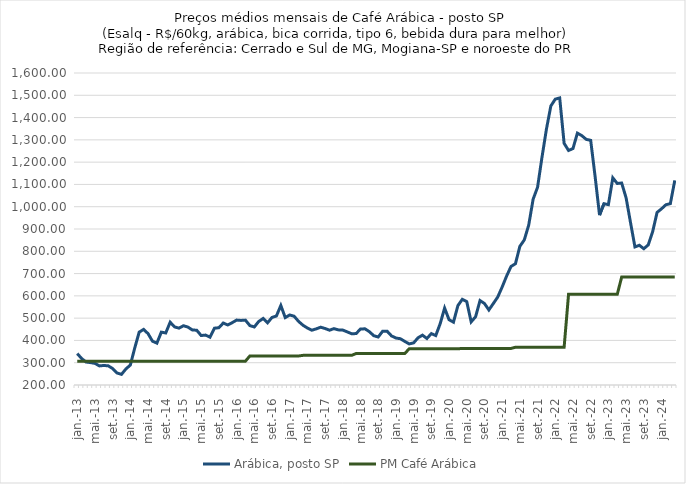
| Category | Arábica, posto SP | PM Café Arábica |
|---|---|---|
| 2013-01-01 | 341.166 | 307 |
| 2013-02-01 | 318.712 | 307 |
| 2013-03-01 | 303.054 | 307 |
| 2013-04-01 | 300.587 | 307 |
| 2013-05-01 | 297.253 | 307 |
| 2013-06-01 | 285.707 | 307 |
| 2013-07-01 | 287.572 | 307 |
| 2013-08-01 | 286.175 | 307 |
| 2013-09-01 | 273.901 | 307 |
| 2013-10-01 | 253.937 | 307 |
| 2013-11-01 | 247.729 | 307 |
| 2013-12-01 | 272.095 | 307 |
| 2014-01-01 | 289.435 | 307 |
| 2014-02-01 | 366.323 | 307 |
| 2014-03-01 | 437.237 | 307 |
| 2014-04-01 | 449.452 | 307 |
| 2014-05-01 | 430.557 | 307 |
| 2014-06-01 | 396.734 | 307 |
| 2014-07-01 | 387.72 | 307 |
| 2014-08-01 | 437.192 | 307 |
| 2014-09-01 | 433.523 | 307 |
| 2014-10-01 | 481.643 | 307 |
| 2014-11-01 | 460.557 | 307 |
| 2014-12-01 | 455.201 | 307 |
| 2015-01-01 | 465.926 | 307 |
| 2015-02-01 | 459.993 | 307 |
| 2015-03-01 | 447.102 | 307 |
| 2015-04-01 | 445.686 | 307 |
| 2015-05-01 | 421.945 | 307 |
| 2015-06-01 | 424.023 | 307 |
| 2015-07-01 | 414.498 | 307 |
| 2015-08-01 | 454.981 | 307 |
| 2015-09-01 | 456.954 | 307 |
| 2015-10-01 | 478.11 | 307 |
| 2015-11-01 | 469.394 | 307 |
| 2015-12-01 | 479.505 | 307 |
| 2016-01-01 | 491.313 | 307 |
| 2016-02-01 | 489.824 | 307 |
| 2016-03-01 | 491.065 | 307 |
| 2016-04-01 | 466.707 | 330.24 |
| 2016-05-01 | 460.367 | 330.24 |
| 2016-06-01 | 484.872 | 330.24 |
| 2016-07-01 | 498.517 | 330.24 |
| 2016-08-01 | 479.037 | 330.24 |
| 2016-09-01 | 502.947 | 330.24 |
| 2016-10-01 | 509.528 | 330.24 |
| 2016-11-01 | 556.744 | 330.24 |
| 2016-12-01 | 502.434 | 330.24 |
| 2017-01-01 | 514.232 | 330.24 |
| 2017-02-01 | 508.654 | 330.24 |
| 2017-03-01 | 485.465 | 330.24 |
| 2017-04-01 | 468.214 | 333.03 |
| 2017-05-01 | 455.688 | 333.03 |
| 2017-06-01 | 445.851 | 333.03 |
| 2017-07-01 | 451.904 | 333.03 |
| 2017-08-01 | 459.36 | 333.03 |
| 2017-09-01 | 453.463 | 333.03 |
| 2017-10-01 | 445.95 | 333.03 |
| 2017-11-01 | 452.876 | 333.03 |
| 2017-12-01 | 447.363 | 333.03 |
| 2018-01-01 | 446.422 | 333.03 |
| 2018-02-01 | 438.327 | 333.03 |
| 2018-03-01 | 430.095 | 333.03 |
| 2018-04-01 | 430.712 | 341.21 |
| 2018-05-01 | 451.019 | 341.21 |
| 2018-06-01 | 452.169 | 341.21 |
| 2018-07-01 | 439.245 | 341.21 |
| 2018-08-01 | 421.155 | 341.21 |
| 2018-09-01 | 415.391 | 341.21 |
| 2018-10-01 | 441.231 | 341.21 |
| 2018-11-01 | 441.653 | 341.21 |
| 2018-12-01 | 420.323 | 341.21 |
| 2019-01-01 | 410.871 | 341.21 |
| 2019-02-01 | 407.7 | 341.21 |
| 2019-03-01 | 395.608 | 341.21 |
| 2019-04-01 | 384.353 | 362.53 |
| 2019-05-01 | 389.037 | 362.53 |
| 2019-06-01 | 411.936 | 362.53 |
| 2019-07-01 | 423.668 | 362.53 |
| 2019-08-01 | 408.743 | 362.53 |
| 2019-09-01 | 430.63 | 362.53 |
| 2019-10-01 | 421.838 | 362.53 |
| 2019-11-01 | 475.113 | 362.53 |
| 2019-12-01 | 545.171 | 362.53 |
| 2020-01-01 | 493.033 | 362.53 |
| 2020-02-01 | 481.905 | 362.53 |
| 2020-03-01 | 556.284 | 362.53 |
| 2020-04-01 | 584.56 | 364.09 |
| 2020-05-01 | 574.159 | 364.09 |
| 2020-06-01 | 483.249 | 364.09 |
| 2020-07-01 | 506.299 | 364.09 |
| 2020-08-01 | 578.848 | 364.09 |
| 2020-09-01 | 565.792 | 364.09 |
| 2020-10-01 | 536.682 | 364.09 |
| 2020-11-01 | 565.468 | 364.09 |
| 2020-12-01 | 594.637 | 364.09 |
| 2021-01-01 | 639.71 | 364.09 |
| 2021-02-01 | 688.523 | 364.09 |
| 2021-03-01 | 731.862 | 364.09 |
| 2021-04-01 | 744.137 | 369.4 |
| 2021-05-01 | 822.239 | 369.4 |
| 2021-06-01 | 850.963 | 369.4 |
| 2021-07-01 | 917.588 | 369.4 |
| 2021-08-01 | 1033.925 | 369.4 |
| 2021-09-01 | 1087.423 | 369.4 |
| 2021-10-01 | 1222.201 | 369.4 |
| 2021-11-01 | 1347.728 | 369.4 |
| 2021-12-01 | 1452.155 | 369.4 |
| 2022-01-01 | 1482.589 | 369.4 |
| 2022-02-01 | 1488.176 | 369.4 |
| 2022-03-01 | 1284.41 | 369.4 |
| 2022-04-01 | 1252.301 | 606.66 |
| 2022-05-01 | 1261.082 | 606.66 |
| 2022-06-01 | 1330.206 | 606.66 |
| 2022-07-01 | 1318.787 | 606.66 |
| 2022-08-01 | 1302.16 | 606.66 |
| 2022-09-01 | 1297.93 | 606.66 |
| 2022-10-01 | 1135.492 | 606.66 |
| 2022-11-01 | 962.213 | 606.66 |
| 2022-12-01 | 1013.523 | 606.66 |
| 2023-01-01 | 1009.27 | 606.66 |
| 2023-02-01 | 1129.529 | 606.66 |
| 2023-03-01 | 1104.215 | 606.66 |
| 2023-04-01 | 1106.358 | 684.16 |
| 2023-05-01 | 1039.877 | 684.16 |
| 2023-06-01 | 928.861 | 684.16 |
| 2023-07-01 | 819.611 | 684.16 |
| 2023-08-01 | 826.89 | 684.16 |
| 2023-09-01 | 811.559 | 684.16 |
| 2023-10-01 | 828.519 | 684.16 |
| 2023-11-01 | 888.004 | 684.16 |
| 2023-12-01 | 974.456 | 684.16 |
| 2024-01-01 | 990.636 | 684.16 |
| 2024-02-01 | 1008.881 | 684.16 |
| 2024-03-01 | 1013.917 | 684.16 |
| 2024-04-01 | 1118.122 | 684.16 |